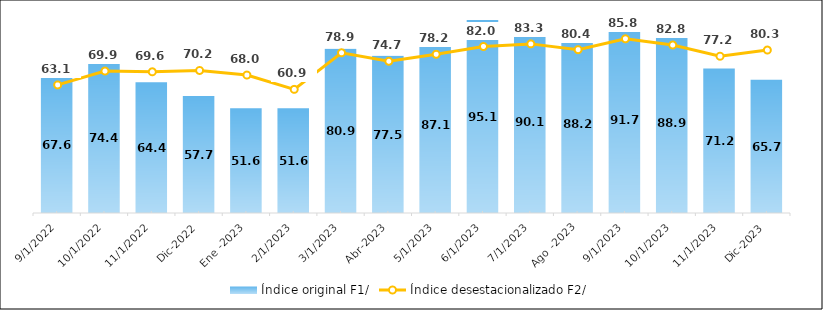
| Category |  Índice original F1/  |
|---|---|
| Sep-2022 | 67.645 |
| Oct-2022 | 74.385 |
| Nov -2022 | 64.384 |
| Dic-2022 | 57.691 |
| Ene -2023 | 51.573 |
| Feb -2023 | 51.578 |
| Mar -2023 | 80.873 |
| Abr-2023 | 77.471 |
| May-2023 | 87.107 |
| Jun-2023 | 95.086 |
| Jul-2023 | 90.146 |
| Ago -2023 | 88.207 |
| Sep-2023 | 91.691 |
| Oct-2023 | 88.868 |
| Nov -2023 | 71.206 |
| Dic-2023 | 65.727 |